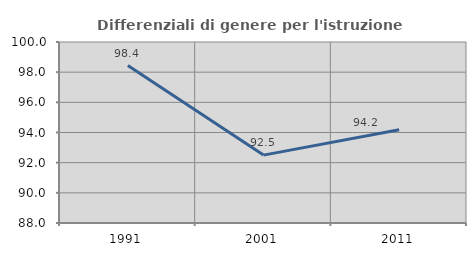
| Category | Differenziali di genere per l'istruzione superiore |
|---|---|
| 1991.0 | 98.434 |
| 2001.0 | 92.5 |
| 2011.0 | 94.184 |